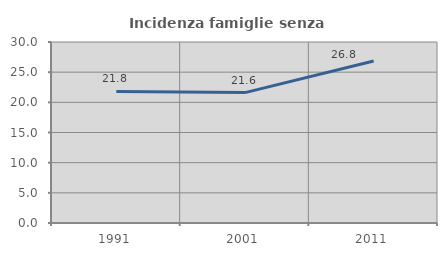
| Category | Incidenza famiglie senza nuclei |
|---|---|
| 1991.0 | 21.806 |
| 2001.0 | 21.61 |
| 2011.0 | 26.85 |